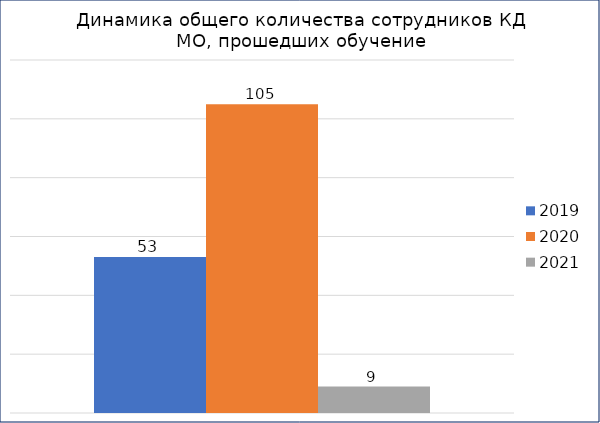
| Category | 2019 | 2020 | 2021 |
|---|---|---|---|
| ИТОГО обученных сотрудников: | 53 | 105 | 9 |